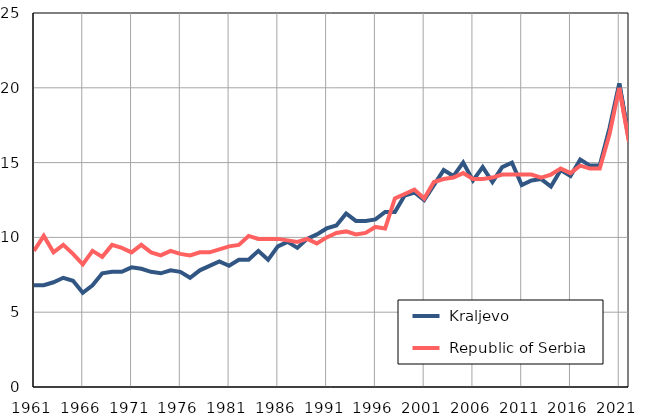
| Category |  Kraljevo |  Republic of Serbia |
|---|---|---|
| 1961.0 | 6.8 | 9.1 |
| 1962.0 | 6.8 | 10.1 |
| 1963.0 | 7 | 9 |
| 1964.0 | 7.3 | 9.5 |
| 1965.0 | 7.1 | 8.9 |
| 1966.0 | 6.3 | 8.2 |
| 1967.0 | 6.8 | 9.1 |
| 1968.0 | 7.6 | 8.7 |
| 1969.0 | 7.7 | 9.5 |
| 1970.0 | 7.7 | 9.3 |
| 1971.0 | 8 | 9 |
| 1972.0 | 7.9 | 9.5 |
| 1973.0 | 7.7 | 9 |
| 1974.0 | 7.6 | 8.8 |
| 1975.0 | 7.8 | 9.1 |
| 1976.0 | 7.7 | 8.9 |
| 1977.0 | 7.3 | 8.8 |
| 1978.0 | 7.8 | 9 |
| 1979.0 | 8.1 | 9 |
| 1980.0 | 8.4 | 9.2 |
| 1981.0 | 8.1 | 9.4 |
| 1982.0 | 8.5 | 9.5 |
| 1983.0 | 8.5 | 10.1 |
| 1984.0 | 9.1 | 9.9 |
| 1985.0 | 8.5 | 9.9 |
| 1986.0 | 9.4 | 9.9 |
| 1987.0 | 9.7 | 9.8 |
| 1988.0 | 9.3 | 9.7 |
| 1989.0 | 9.9 | 9.9 |
| 1990.0 | 10.2 | 9.6 |
| 1991.0 | 10.6 | 10 |
| 1992.0 | 10.8 | 10.3 |
| 1993.0 | 11.6 | 10.4 |
| 1994.0 | 11.1 | 10.2 |
| 1995.0 | 11.1 | 10.3 |
| 1996.0 | 11.2 | 10.7 |
| 1997.0 | 11.7 | 10.6 |
| 1998.0 | 11.7 | 12.6 |
| 1999.0 | 12.8 | 12.9 |
| 2000.0 | 13 | 13.2 |
| 2001.0 | 12.5 | 12.6 |
| 2002.0 | 13.5 | 13.7 |
| 2003.0 | 14.5 | 13.9 |
| 2004.0 | 14.1 | 14 |
| 2005.0 | 15 | 14.3 |
| 2006.0 | 13.8 | 13.9 |
| 2007.0 | 14.7 | 13.9 |
| 2008.0 | 13.7 | 14 |
| 2009.0 | 14.7 | 14.2 |
| 2010.0 | 15 | 14.2 |
| 2011.0 | 13.5 | 14.2 |
| 2012.0 | 13.8 | 14.2 |
| 2013.0 | 13.9 | 14 |
| 2014.0 | 13.4 | 14.2 |
| 2015.0 | 14.5 | 14.6 |
| 2016.0 | 14.1 | 14.3 |
| 2017.0 | 15.2 | 14.8 |
| 2018.0 | 14.8 | 14.6 |
| 2019.0 | 14.8 | 14.6 |
| 2020.0 | 17.3 | 16.9 |
| 2021.0 | 20.3 | 20 |
| 2022.0 | 16.6 | 16.4 |